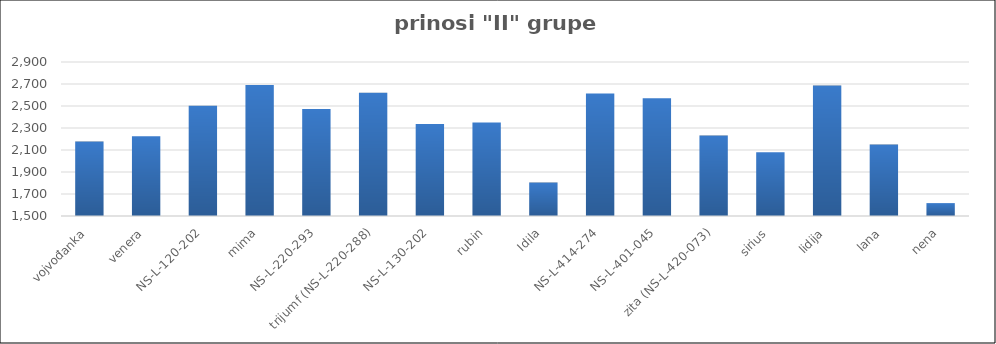
| Category | Series 0 |
|---|---|
| vojvođanka | 2176.988 |
| venera | 2225.3 |
| NS-L-120-202 | 2502.95 |
| mima | 2690.633 |
| NS-L-220-293 | 2473.5 |
| trijumf (NS-L-220-288) | 2621.567 |
| NS-L-130-202 | 2335.5 |
| rubin | 2350.145 |
| Idila | 1804.226 |
| NS-L-414-274 | 2613.821 |
| NS-L-401-045 | 2570.741 |
| zita (NS-L-420-073) | 2231 |
| sirius | 2080 |
| lidija | 2685.6 |
| lana | 2149.1 |
| nena | 1617.2 |